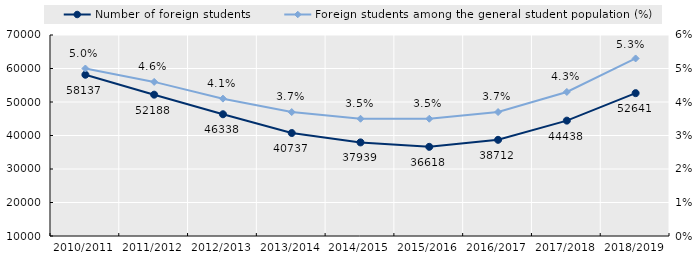
| Category | Number of foreign students |
|---|---|
| 2010/2011 | 58137 |
| 2011/2012 | 52188 |
| 2012/2013 | 46338 |
| 2013/2014 | 40737 |
| 2014/2015 | 37939 |
| 2015/2016 | 36618 |
| 2016/2017 | 38712 |
| 2017/2018 | 44438 |
| 2018/2019 | 52641 |